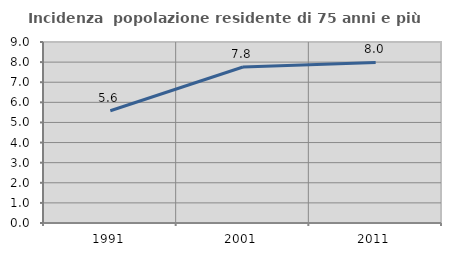
| Category | Incidenza  popolazione residente di 75 anni e più |
|---|---|
| 1991.0 | 5.581 |
| 2001.0 | 7.758 |
| 2011.0 | 7.982 |